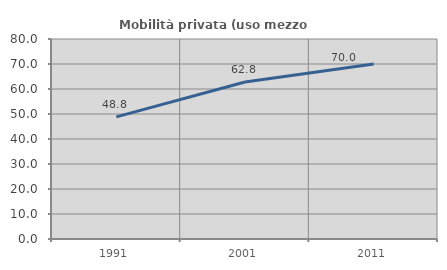
| Category | Mobilità privata (uso mezzo privato) |
|---|---|
| 1991.0 | 48.846 |
| 2001.0 | 62.823 |
| 2011.0 | 69.968 |